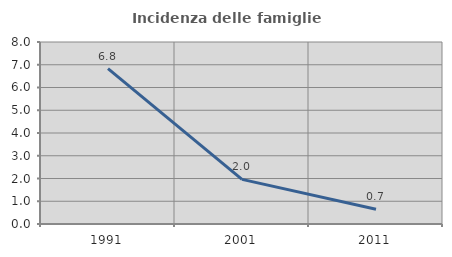
| Category | Incidenza delle famiglie numerose |
|---|---|
| 1991.0 | 6.832 |
| 2001.0 | 1.961 |
| 2011.0 | 0.651 |